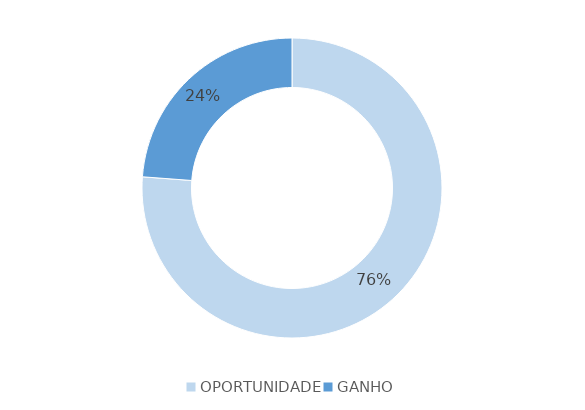
| Category | Series 0 |
|---|---|
| OPORTUNIDADE | 16 |
| GANHO | 5 |